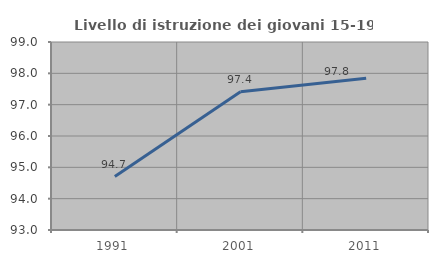
| Category | Livello di istruzione dei giovani 15-19 anni |
|---|---|
| 1991.0 | 94.706 |
| 2001.0 | 97.412 |
| 2011.0 | 97.843 |